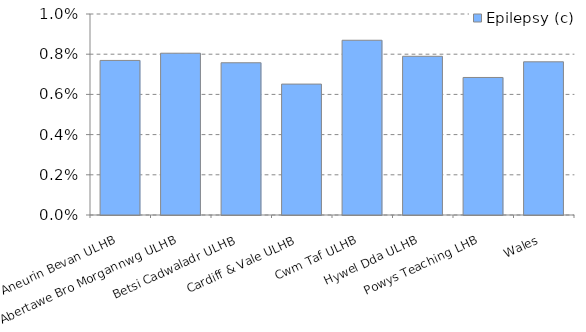
| Category | Epilepsy (c) |
|---|---|
| Aneurin Bevan ULHB | 0.008 |
| Abertawe Bro Morgannwg ULHB | 0.008 |
| Betsi Cadwaladr ULHB | 0.008 |
| Cardiff & Vale ULHB | 0.007 |
| Cwm Taf ULHB | 0.009 |
| Hywel Dda ULHB | 0.008 |
| Powys Teaching LHB | 0.007 |
| Wales | 0.008 |